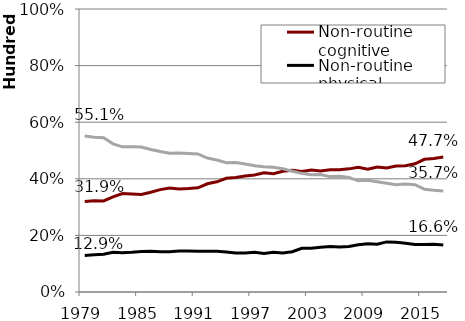
| Category | Non-routine cognitive | Non-routine physical | Routine |
|---|---|---|---|
| 1979.0 | 31.94 | 12.92 | 55.14 |
| 1980.0 | 32.2 | 13.13 | 54.67 |
| 1981.0 | 32.19 | 13.32 | 54.5 |
| 1982.0 | 33.59 | 14.06 | 52.35 |
| 1983.0 | 34.8 | 13.89 | 51.3 |
| 1984.0 | 34.65 | 14.05 | 51.3 |
| 1985.0 | 34.43 | 14.31 | 51.26 |
| 1986.0 | 35.24 | 14.4 | 50.37 |
| 1987.0 | 36.18 | 14.19 | 49.62 |
| 1988.0 | 36.75 | 14.24 | 49.01 |
| 1989.0 | 36.44 | 14.46 | 49.1 |
| 1990.0 | 36.57 | 14.47 | 48.96 |
| 1991.0 | 36.81 | 14.42 | 48.77 |
| 1992.0 | 38.25 | 14.43 | 47.32 |
| 1993.0 | 38.94 | 14.4 | 46.66 |
| 1994.0 | 40.16 | 14.17 | 45.67 |
| 1995.0 | 40.47 | 13.78 | 45.75 |
| 1996.0 | 41.01 | 13.77 | 45.22 |
| 1997.0 | 41.32 | 14.08 | 44.6 |
| 1998.0 | 42.15 | 13.63 | 44.22 |
| 1999.0 | 41.83 | 14.07 | 44.11 |
| 2000.0 | 42.67 | 13.8 | 43.52 |
| 2001.0 | 43.06 | 14.25 | 42.69 |
| 2002.0 | 42.59 | 15.47 | 41.93 |
| 2003.0 | 43.13 | 15.44 | 41.43 |
| 2004.0 | 42.73 | 15.78 | 41.49 |
| 2005.0 | 43.17 | 16.06 | 40.77 |
| 2006.0 | 43.16 | 15.91 | 40.93 |
| 2007.0 | 43.51 | 16.05 | 40.44 |
| 2008.0 | 44.05 | 16.67 | 39.29 |
| 2009.0 | 43.42 | 17.07 | 39.51 |
| 2010.0 | 44.14 | 16.86 | 38.99 |
| 2011.0 | 43.85 | 17.7 | 38.46 |
| 2012.0 | 44.53 | 17.6 | 37.87 |
| 2013.0 | 44.65 | 17.2 | 38.15 |
| 2014.0 | 45.31 | 16.79 | 37.9 |
| 2015.0 | 46.89 | 16.79 | 36.32 |
| 2016.0 | 47.14 | 16.88 | 35.98 |
| 2017.0 | 47.67 | 16.6 | 35.73 |